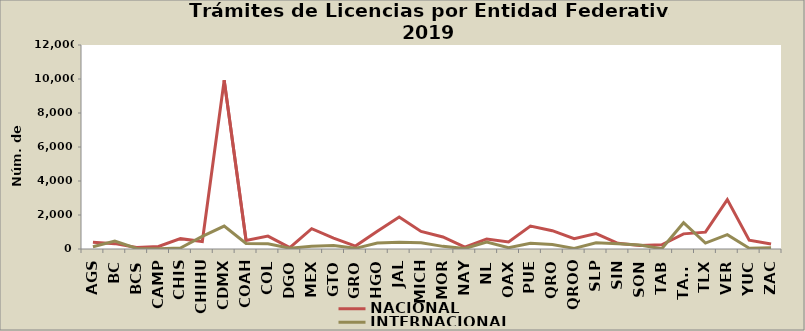
| Category | NACIONAL | INTERNACIONAL |
|---|---|---|
| AGS | 390 | 128 |
| BC | 315 | 467 |
| BCS | 92 | 29 |
| CAMP | 151 | 15 |
| CHIS | 609 | 60 |
| CHIHU | 439 | 743 |
| CDMX | 9927 | 1346 |
| COAH | 496 | 322 |
| COL | 758 | 305 |
| DGO | 80 | 46 |
| MEX | 1194 | 162 |
| GTO | 634 | 211 |
| GRO | 170 | 39 |
| HGO | 1049 | 349 |
| JAL | 1887 | 401 |
| MICH | 1032 | 368 |
| MOR | 705 | 155 |
| NAY | 106 | 26 |
| NL | 593 | 410 |
| OAX | 419 | 75 |
| PUE | 1349 | 335 |
| QRO | 1077 | 263 |
| QROO | 604 | 38 |
| SLP | 904 | 361 |
| SIN | 335 | 310 |
| SON | 211 | 235 |
| TAB | 245 | 11 |
| TAMS | 890 | 1543 |
| TLX | 990 | 346 |
| VER | 2909 | 840 |
| YUC | 520 | 49 |
| ZAC | 297 | 69 |